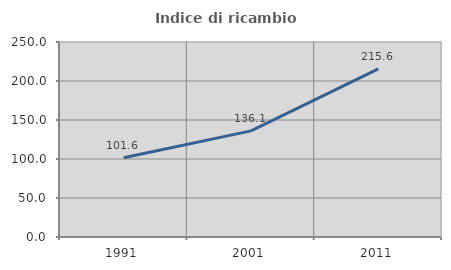
| Category | Indice di ricambio occupazionale  |
|---|---|
| 1991.0 | 101.613 |
| 2001.0 | 136.082 |
| 2011.0 | 215.556 |